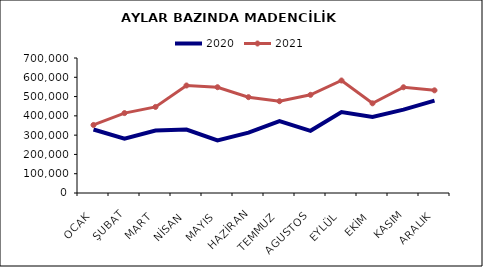
| Category | 2020 | 2021 |
|---|---|---|
| OCAK | 329222.773 | 352755.259 |
| ŞUBAT | 282226.846 | 414333.151 |
| MART | 323949.137 | 446331.343 |
| NİSAN | 329256.433 | 557451.146 |
| MAYIS | 272368.702 | 548536.748 |
| HAZİRAN | 312612.13 | 496926.941 |
| TEMMUZ | 372489.721 | 475911.594 |
| AGUSTOS | 322478.514 | 508972.528 |
| EYLÜL | 420079.686 | 583321.285 |
| EKİM | 393981.222 | 465084.559 |
| KASIM | 432334.802 | 548240.196 |
| ARALIK | 478794.476 | 532299.948 |